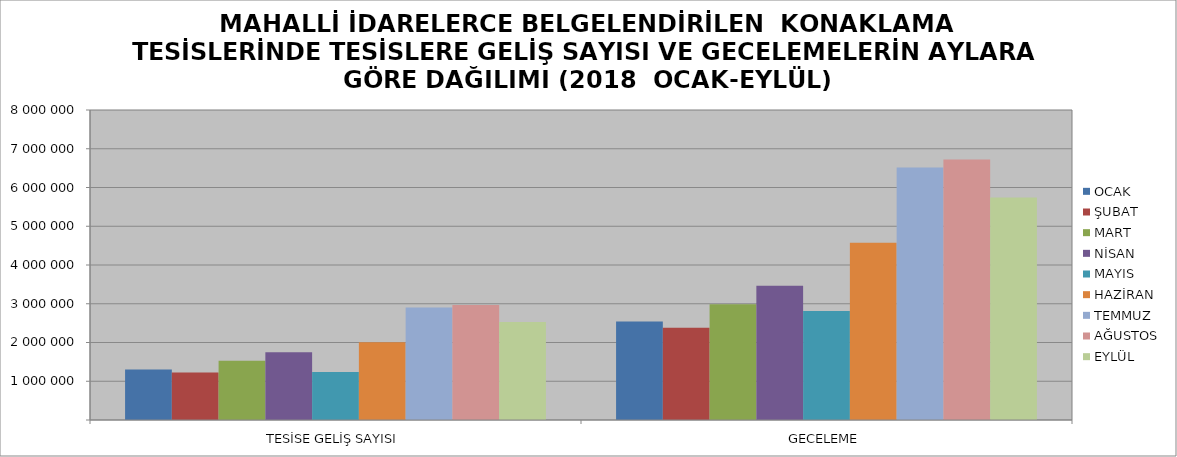
| Category | OCAK | ŞUBAT | MART | NİSAN | MAYIS | HAZİRAN | TEMMUZ | AĞUSTOS | EYLÜL |
|---|---|---|---|---|---|---|---|---|---|
| TESİSE GELİŞ SAYISI | 1303353 | 1223475 | 1526172 | 1749085 | 1240889 | 2003881 | 2904028 | 2966995 | 2525986 |
| GECELEME | 2542103 | 2381300 | 2986820 | 3463261 | 2810808 | 4572629 | 6517690 | 6721558 | 5740112 |